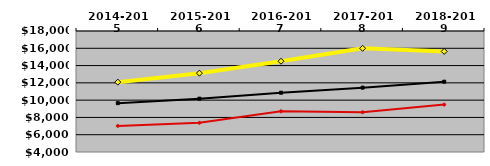
| Category | NATIONAL MEDIAN | WEST MEDIAN | TEXAS LUTHERAN |
|---|---|---|---|
| 2014-2015 | 9651.331 | 7018.372 | 12082.598 |
| 2015-2016 | 10170.953 | 7373.941 | 13120.524 |
| 2016-2017 | 10859.41 | 8710.76 | 14503.602 |
| 2017-2018 | 11445.61 | 8601.864 | 15999.237 |
| 2018-2019 | 12133.725 | 9482.813 | 15639.308 |